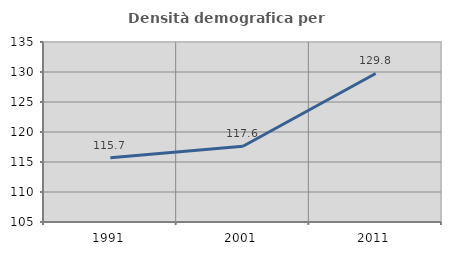
| Category | Densità demografica |
|---|---|
| 1991.0 | 115.712 |
| 2001.0 | 117.629 |
| 2011.0 | 129.756 |